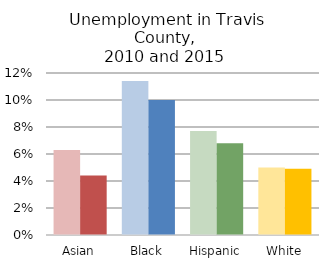
| Category | 2006-2010 | 2011-2015 |
|---|---|---|
| Asian | 0.063 | 0.044 |
| Black | 0.114 | 0.1 |
| Hispanic | 0.077 | 0.068 |
| White | 0.05 | 0.049 |